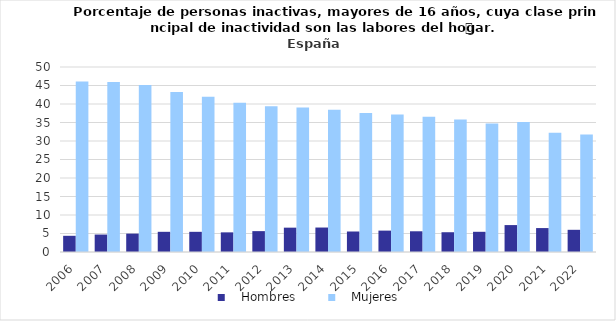
| Category |    Hombres |    Mujeres |
|---|---|---|
| 2006.0 | 4.377 | 46.082 |
| 2007.0 | 4.717 | 45.919 |
| 2008.0 | 4.969 | 45.118 |
| 2009.0 | 5.456 | 43.226 |
| 2010.0 | 5.454 | 41.928 |
| 2011.0 | 5.309 | 40.353 |
| 2012.0 | 5.64 | 39.39 |
| 2013.0 | 6.578 | 39.037 |
| 2014.0 | 6.612 | 38.441 |
| 2015.0 | 5.541 | 37.58 |
| 2016.0 | 5.778 | 37.157 |
| 2017.0 | 5.601 | 36.524 |
| 2018.0 | 5.345 | 35.782 |
| 2019.0 | 5.46 | 34.727 |
| 2020.0 | 7.276 | 35.109 |
| 2021.0 | 6.467 | 32.247 |
| 2022.0 | 5.997 | 31.725 |